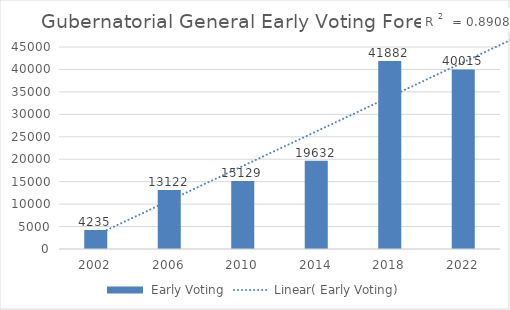
| Category | Series 0 |
|---|---|
| 2002.0 | 4235 |
| 2006.0 | 13122 |
| 2010.0 | 15129 |
| 2014.0 | 19632 |
| 2018.0 | 41882 |
| 2022.0 | 40015 |